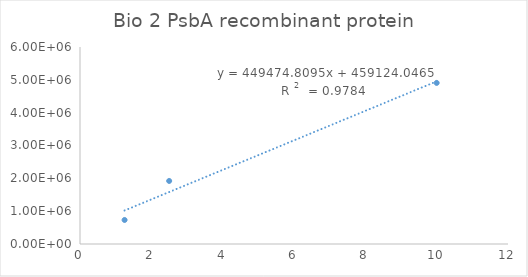
| Category | Series 0 |
|---|---|
| 10.0 | 4905676.8 |
| 2.5 | 1920178.46 |
| 1.25 | 731795.51 |